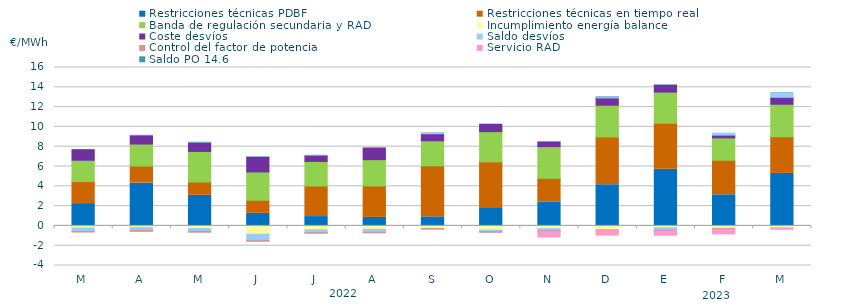
| Category | Restricciones técnicas PDBF | Restricciones técnicas en tiempo real | Banda de regulación secundaria y RAD | Incumplimiento energía balance | Coste desvíos | Saldo desvíos | Control del factor de potencia | Servicio RAD | Saldo PO 14.6 |
|---|---|---|---|---|---|---|---|---|---|
| M | 2.25 | 2.22 | 2.16 | -0.21 | 1.07 | -0.34 | -0.07 | 0 | 0 |
| A | 4.32 | 1.73 | 2.22 | -0.16 | 0.83 | -0.3 | -0.09 | 0 | 0.05 |
| M | 3.09 | 1.34 | 3.09 | -0.27 | 0.84 | -0.29 | -0.08 | 0 | 0.09 |
| J | 1.27 | 1.32 | 2.86 | -0.84 | 1.49 | -0.65 | -0.06 | 0 | 0.04 |
| J | 0.94 | 3.09 | 2.48 | -0.39 | 0.53 | -0.29 | -0.06 | 0 | 0.09 |
| A | 0.86 | 3.17 | 2.66 | -0.34 | 1.14 | -0.29 | -0.07 | 0 | 0.07 |
| S | 0.91 | 5.15 | 2.54 | -0.26 | 0.71 | 0.08 | -0.07 | 0 | 0.03 |
| O | 1.76 | 4.71 | 3.05 | -0.42 | 0.72 | -0.15 | -0.08 | 0 | 0.04 |
| N | 2.42 | 2.39 | 3.2 | -0.27 | 0.47 | -0.22 | -0.09 | -0.64 | 0.02 |
| D | 4.16 | 4.82 | 3.21 | -0.4 | 0.74 | 0.03 | -0.08 | -0.55 | 0.07 |
| E | 5.73 | 4.64 | 3.15 | -0.19 | 0.69 | -0.24 | -0.08 | -0.53 | 0.04 |
| F | 3.14 | 3.49 | 2.26 | -0.25 | 0.28 | 0.18 | -0.08 | -0.58 | 0.01 |
| M | 5.31 | 3.69 | 3.29 | -0.2 | 0.7 | 0.41 | 0 | -0.24 | 0.05 |